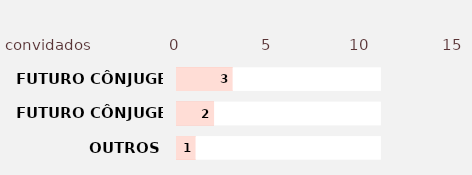
| Category | Series 2 | Series 3 | Series 1 | Series 0 |
|---|---|---|---|---|
| OUTROS | 11 | 1 | 11 | 1 |
| FUTURO CÔNJUGE 2 | 11 | 2 | 11 | 2 |
| FUTURO CÔNJUGE 1 | 11 | 3 | 11 | 3 |